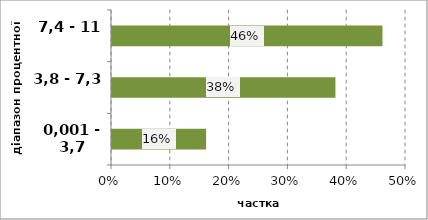
| Category | Series 0 |
|---|---|
| 0,001 - 3,7 | 0.16 |
| 3,8 - 7,3 | 0.38 |
| 7,4 - 11 | 0.46 |